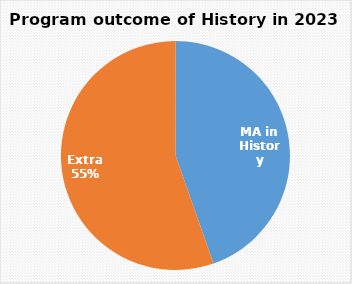
| Category | Series 0 |
|---|---|
| MA in History | 29 |
| Extra | 36 |